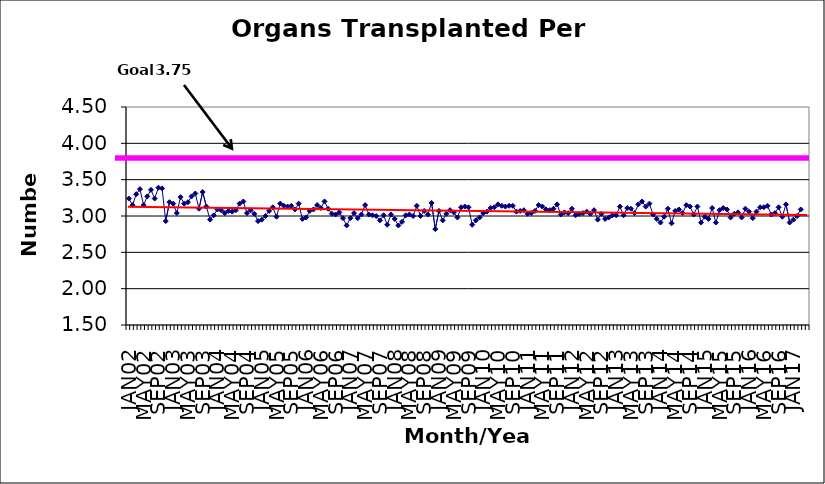
| Category | Series 0 |
|---|---|
| JAN02 | 3.24 |
| FEB02 | 3.15 |
| MAR02 | 3.3 |
| APR02 | 3.37 |
| MAY02 | 3.15 |
| JUN02 | 3.27 |
| JUL02 | 3.36 |
| AUG02 | 3.24 |
| SEP02 | 3.39 |
| OCT02 | 3.38 |
| NOV02 | 2.93 |
| DEC02 | 3.19 |
| JAN03 | 3.17 |
| FEB03 | 3.04 |
| MAR03 | 3.26 |
| APR03 | 3.17 |
| MAY03 | 3.19 |
| JUN03 | 3.27 |
| JUL03 | 3.31 |
| AUG03 | 3.1 |
| SEP03 | 3.33 |
| OCT03 | 3.13 |
| NOV03 | 2.95 |
| DEC03 | 3.01 |
| JAN04 | 3.09 |
| FEB04 | 3.08 |
| MAR04 | 3.04 |
| APR04 | 3.07 |
| MAY04 | 3.06 |
| JUN04 | 3.08 |
| JUL04 | 3.17 |
| AUG04 | 3.2 |
| SEP04 | 3.04 |
| OCT04 | 3.08 |
| NOV04 | 3.03 |
| DEC04 | 2.93 |
| JAN05 | 2.95 |
| FEB05 | 3 |
| MAR05 | 3.07 |
| APR05 | 3.12 |
| MAY05 | 2.99 |
| JUN05 | 3.17 |
| JUL05 | 3.14 |
| AUG05 | 3.13 |
| SEP05 | 3.14 |
| OCT05 | 3.09 |
| NOV05 | 3.17 |
| DEC05 | 2.96 |
| JAN06 | 2.98 |
| FEB06 | 3.07 |
| MAR06 | 3.09 |
| APR06 | 3.15 |
| MAY06 | 3.11 |
| JUN06 | 3.2 |
| JUL06 | 3.1 |
| AUG06 | 3.03 |
| SEP06 | 3.02 |
| OCT06 | 3.05 |
| NOV06 | 2.97 |
| DEC06 | 2.87 |
| JAN07 | 2.97 |
| FEB07 | 3.04 |
| MAR07 | 2.97 |
| APR07 | 3.02 |
| MAY07 | 3.15 |
| JUN07 | 3.02 |
| JUL07 | 3.01 |
| AUG07 | 3 |
| SEP07 | 2.94 |
| OCT07 | 3.01 |
| NOV07 | 2.88 |
| DEC07 | 3.02 |
| JAN08 | 2.96 |
| FEB08 | 2.87 |
| MAR08 | 2.92 |
| APR08 | 3.01 |
| MAY08 | 3.02 |
| JUN08 | 3 |
| JUL08 | 3.14 |
| AUG08 | 3 |
| SEP08 | 3.07 |
| OCT08 | 3.02 |
| NOV08 | 3.18 |
| DEC08 | 2.82 |
| JAN09 | 3.07 |
| FEB09 | 2.94 |
| MAR09 | 3.03 |
| APR09 | 3.08 |
| MAY09 | 3.05 |
| JUN09 | 2.98 |
| JUL09 | 3.12 |
| AUG09 | 3.13 |
| SEP09 | 3.12 |
| OCT09 | 2.88 |
| NOV09 | 2.94 |
| DEC09 | 2.98 |
| JAN10 | 3.04 |
| FEB10 | 3.06 |
| MAR10 | 3.11 |
| APR10 | 3.12 |
| MAY10 | 3.16 |
| JUN10 | 3.14 |
| JUL10 | 3.13 |
| AUG10 | 3.14 |
| SEP10 | 3.14 |
| OCT10 | 3.06 |
| NOV10 | 3.07 |
| DEC10 | 3.08 |
| JAN11 | 3.03 |
| FEB11 | 3.04 |
| MAR11 | 3.07 |
| APR11 | 3.15 |
| MAY11 | 3.13 |
| JUN11 | 3.09 |
| JUL11 | 3.08 |
| AUG11 | 3.1 |
| SEP11 | 3.16 |
| OCT11 | 3.02 |
| NOV11 | 3.05 |
| DEC11 | 3.04 |
| JAN12 | 3.1 |
| FEB12 | 3.01 |
| MAR12 | 3.03 |
| APR12 | 3.04 |
| MAY12 | 3.06 |
| JUN12 | 3.03 |
| JUL12 | 3.08 |
| AUG12 | 2.95 |
| SEP12 | 3.03 |
| OCT12 | 2.96 |
| NOV12 | 2.98 |
| DEC12 | 3.01 |
| JAN13 | 3.01 |
| FEB13 | 3.13 |
| MAR13 | 3.01 |
| APR13 | 3.11 |
| MAY13 | 3.1 |
| JUN13 | 3.04 |
| JUL13 | 3.16 |
| AUG13 | 3.2 |
| SEP13 | 3.13 |
| OCT13 | 3.17 |
| NOV13 | 3.02 |
| DEC13 | 2.96 |
| JAN14 | 2.91 |
| FEB14 | 2.99 |
| MAR14 | 3.1 |
| APR14 | 2.9 |
| MAY14 | 3.07 |
| JUN14 | 3.09 |
| JUL14 | 3.04 |
| AUG14 | 3.15 |
| SEP14 | 3.13 |
| OCT14 | 3.02 |
| NOV14 | 3.13 |
| DEC14 | 2.91 |
| JAN15 | 2.99 |
| FEB15 | 2.96 |
| MAR15 | 3.11 |
| APR15 | 2.91 |
| MAY15 | 3.08 |
| JUN15 | 3.11 |
| JUL15 | 3.09 |
| AUG15 | 2.98 |
| SEP15 | 3.03 |
| OCT15 | 3.05 |
| NOV15 | 2.98 |
| DEC15 | 3.1 |
| JAN16 | 3.06 |
| FEB16 | 2.97 |
| MAR16 | 3.06 |
| APR16 | 3.12 |
| MAY16 | 3.12 |
| JUN16 | 3.14 |
| JUL16 | 3.02 |
| AUG16 | 3.04 |
| SEP16 | 3.12 |
| OCT16 | 2.99 |
| NOV16 | 3.16 |
| DEC16 | 2.91 |
| JAN17 | 2.95 |
| FEB17 | 3 |
| MAR17 | 3.09 |